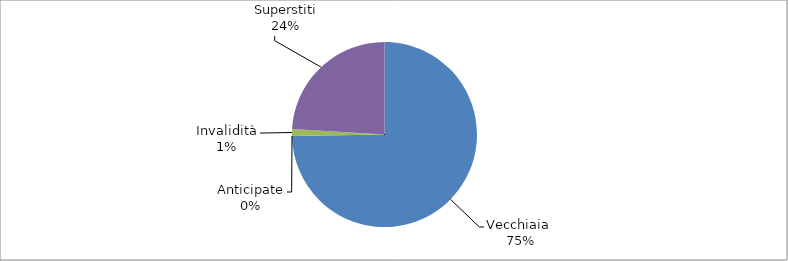
| Category | Series 0 |
|---|---|
| Vecchiaia  | 22156 |
| Anticipate | 0 |
| Invalidità | 366 |
| Superstiti | 7126 |